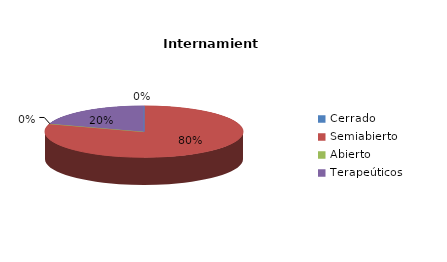
| Category | Series 0 |
|---|---|
| Cerrado | 0 |
| Semiabierto | 4 |
| Abierto | 0 |
| Terapeúticos | 1 |